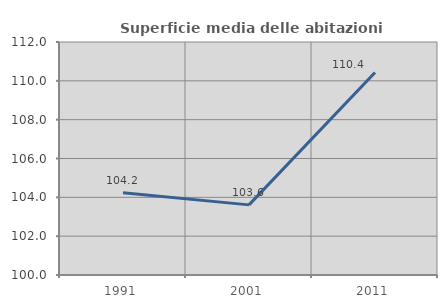
| Category | Superficie media delle abitazioni occupate |
|---|---|
| 1991.0 | 104.232 |
| 2001.0 | 103.611 |
| 2011.0 | 110.425 |